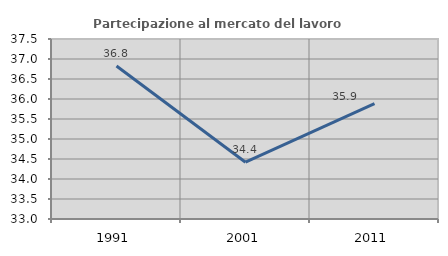
| Category | Partecipazione al mercato del lavoro  femminile |
|---|---|
| 1991.0 | 36.825 |
| 2001.0 | 34.42 |
| 2011.0 | 35.884 |